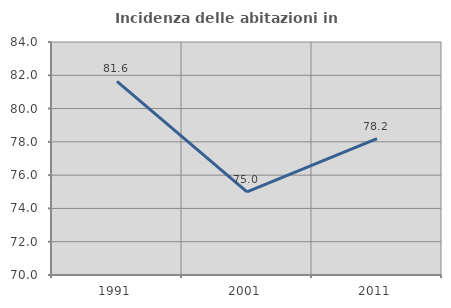
| Category | Incidenza delle abitazioni in proprietà  |
|---|---|
| 1991.0 | 81.628 |
| 2001.0 | 75 |
| 2011.0 | 78.201 |